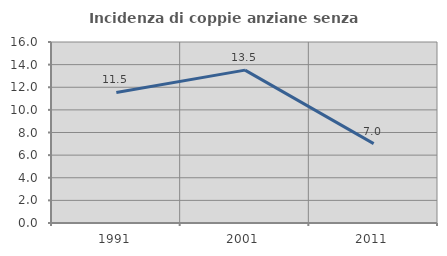
| Category | Incidenza di coppie anziane senza figli  |
|---|---|
| 1991.0 | 11.538 |
| 2001.0 | 13.514 |
| 2011.0 | 7.018 |